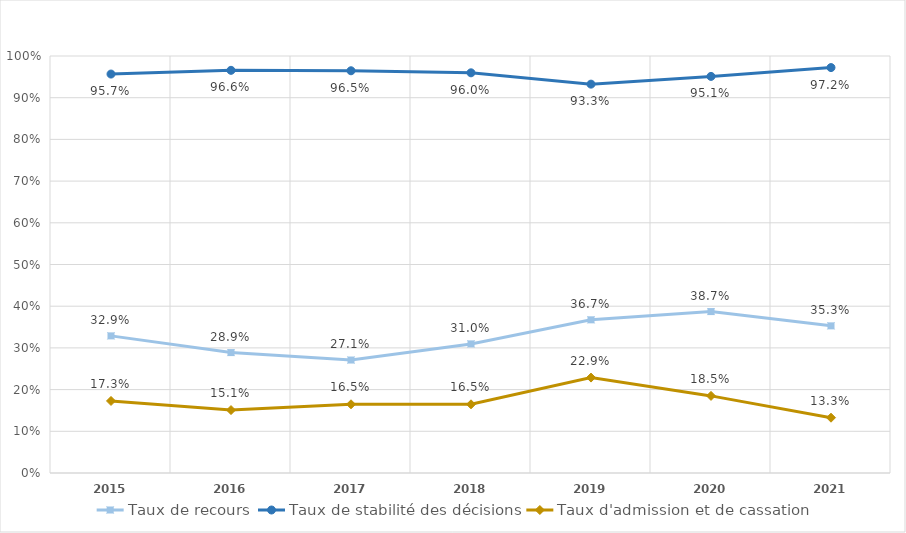
| Category | Taux de recours | Taux de stabilité des décisions | Taux d'admission et de cassation |
|---|---|---|---|
| 2015.0 | 0.329 | 0.957 | 0.173 |
| 2016.0 | 0.289 | 0.966 | 0.151 |
| 2017.0 | 0.271 | 0.965 | 0.165 |
| 2018.0 | 0.31 | 0.96 | 0.165 |
| 2019.0 | 0.367 | 0.933 | 0.229 |
| 2020.0 | 0.387 | 0.951 | 0.185 |
| 2021.0 | 0.353 | 0.972 | 0.133 |